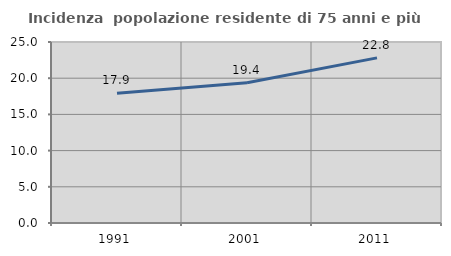
| Category | Incidenza  popolazione residente di 75 anni e più |
|---|---|
| 1991.0 | 17.905 |
| 2001.0 | 19.383 |
| 2011.0 | 22.807 |